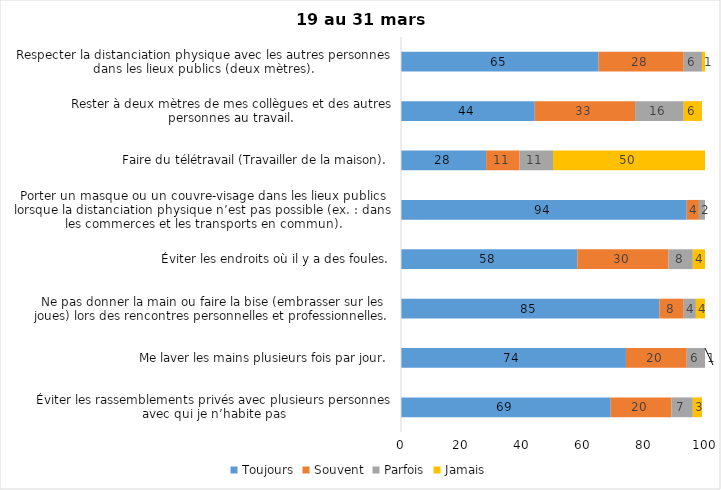
| Category | Toujours | Souvent | Parfois | Jamais |
|---|---|---|---|---|
| Éviter les rassemblements privés avec plusieurs personnes avec qui je n’habite pas | 69 | 20 | 7 | 3 |
| Me laver les mains plusieurs fois par jour. | 74 | 20 | 6 | 1 |
| Ne pas donner la main ou faire la bise (embrasser sur les joues) lors des rencontres personnelles et professionnelles. | 85 | 8 | 4 | 4 |
| Éviter les endroits où il y a des foules. | 58 | 30 | 8 | 4 |
| Porter un masque ou un couvre-visage dans les lieux publics lorsque la distanciation physique n’est pas possible (ex. : dans les commerces et les transports en commun). | 94 | 4 | 2 | 0 |
| Faire du télétravail (Travailler de la maison). | 28 | 11 | 11 | 50 |
| Rester à deux mètres de mes collègues et des autres personnes au travail. | 44 | 33 | 16 | 6 |
| Respecter la distanciation physique avec les autres personnes dans les lieux publics (deux mètres). | 65 | 28 | 6 | 1 |